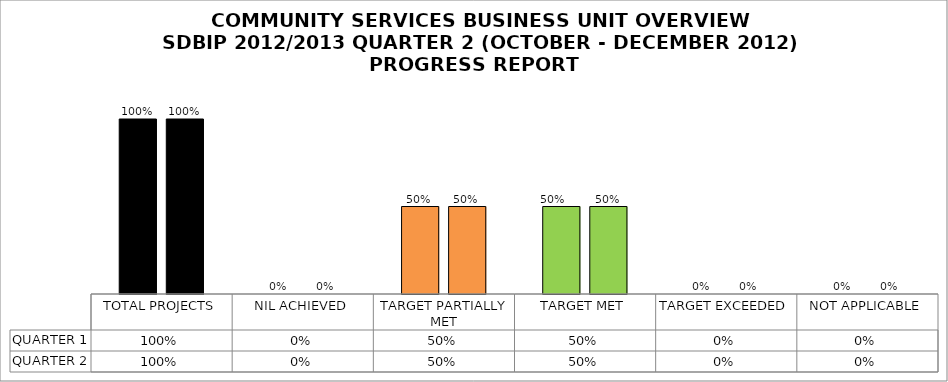
| Category | QUARTER 1 | QUARTER 2 |
|---|---|---|
| TOTAL PROJECTS | 1 | 1 |
| NIL ACHIEVED | 0 | 0 |
| TARGET PARTIALLY MET | 0.5 | 0.5 |
| TARGET MET | 0.5 | 0.5 |
| TARGET EXCEEDED | 0 | 0 |
| NOT APPLICABLE | 0 | 0 |